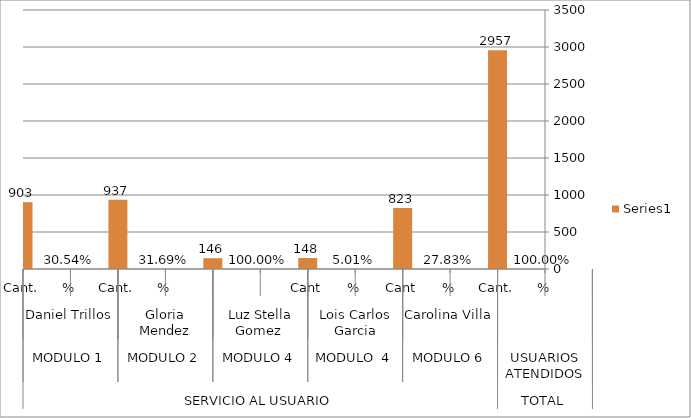
| Category | Series 5 |
|---|---|
| 0 | 903 |
| 1 | 0.305 |
| 2 | 937 |
| 3 | 0.317 |
| 4 | 146 |
| 5 | 1 |
| 6 | 148 |
| 7 | 0.05 |
| 8 | 823 |
| 9 | 0.278 |
| 10 | 2957 |
| 11 | 1 |